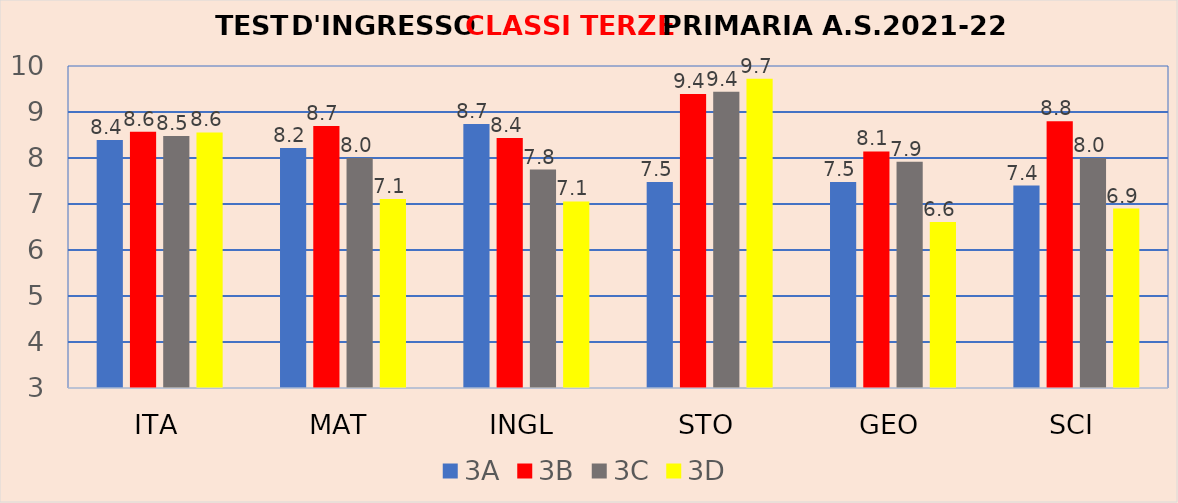
| Category | 3A | 3B | 3C | 3D |
|---|---|---|---|---|
| ITA | 8.391 | 8.571 | 8.48 | 8.556 |
| MAT | 8.217 | 8.696 | 8 | 7.111 |
| INGL | 8.739 | 8.435 | 7.75 | 7.056 |
| STO | 7.478 | 9.391 | 9.44 | 9.722 |
| GEO | 7.478 | 8.143 | 7.92 | 6.611 |
| SCI | 7.4 | 8.8 | 8 | 6.9 |